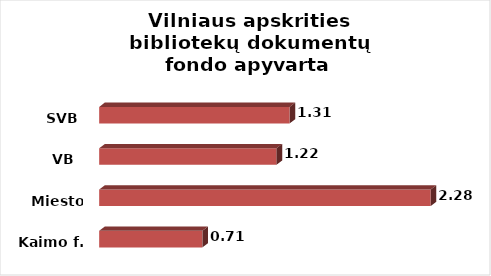
| Category | Series 0 |
|---|---|
| Kaimo f. | 0.71 |
| Miesto f. | 2.28 |
| VB  | 1.22 |
| SVB | 1.31 |